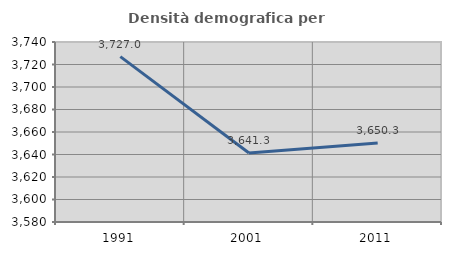
| Category | Densità demografica |
|---|---|
| 1991.0 | 3727.023 |
| 2001.0 | 3641.34 |
| 2011.0 | 3650.311 |